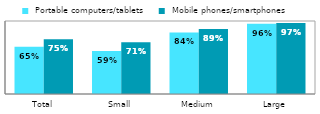
| Category |  Portable computers/tablets |  Mobile phones/smartphones  |
|---|---|---|
| Total | 0.648 | 0.751 |
| Small | 0.589 | 0.71 |
| Medium | 0.843 | 0.889 |
| Large | 0.961 | 0.973 |